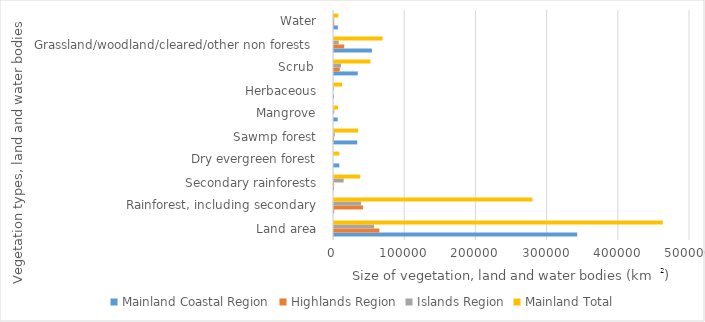
| Category | Mainland Coastal Region | Highlands Region | Islands Region | Mainland Total |
|---|---|---|---|---|
| Land area  | 341588 | 63731 | 56427 | 461739 |
| Rainforest, including secondary  | 200.021 | 40787 | 37961 | 278767 |
| Secondary rainforests  | 23.256 | 144 | 13603 | 36902 |
| Dry evergreen forest  | 7507 | 0 | 0 | 7507 |
| Sawmp forest  | 32637 | 183 | 1047 | 33866 |
| Mangrove  | 5221 | 0 | 513 | 5734 |
| Herbaceous  | 11.294 | 0 | 51 | 11346 |
| Scrub   | 33342 | 8037 | 9842 | 51223 |
| Grassland/woodland/cleared/other non forests   | 53234 | 14317 | 6654 | 68164 |
| Water  | 5377 | 356 | 341 | 6074 |